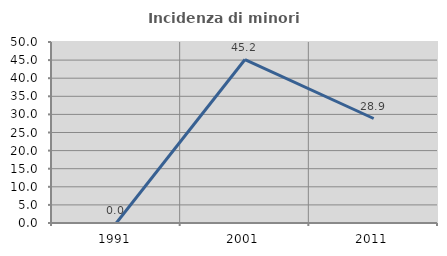
| Category | Incidenza di minori stranieri |
|---|---|
| 1991.0 | 0 |
| 2001.0 | 45.161 |
| 2011.0 | 28.866 |